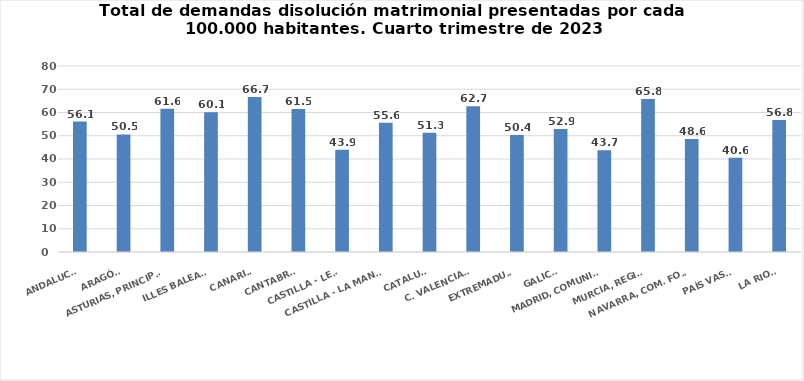
| Category | Series 0 |
|---|---|
| ANDALUCÍA | 56.077 |
| ARAGÓN | 50.544 |
| ASTURIAS, PRINCIPADO | 61.593 |
| ILLES BALEARS | 60.08 |
| CANARIAS | 66.7 |
| CANTABRIA | 61.509 |
| CASTILLA - LEÓN | 43.944 |
| CASTILLA - LA MANCHA | 55.608 |
| CATALUÑA | 51.297 |
| C. VALENCIANA | 62.703 |
| EXTREMADURA | 50.365 |
| GALICIA | 52.931 |
| MADRID, COMUNIDAD | 43.729 |
| MURCIA, REGIÓN | 65.821 |
| NAVARRA, COM. FORAL | 48.646 |
| PAÍS VASCO | 40.587 |
| LA RIOJA | 56.786 |